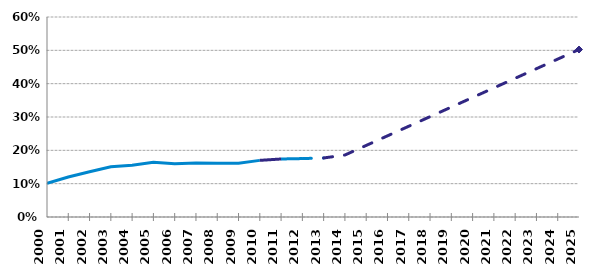
| Category | % EPCI  |
|---|---|
| 2000.0 | 0.101 |
| 2001.0 | 0.12 |
| 2002.0 | 0.136 |
| 2003.0 | 0.151 |
| 2004.0 | 0.155 |
| 2005.0 | 0.164 |
| 2006.0 | 0.16 |
| 2007.0 | 0.162 |
| 2008.0 | 0.161 |
| 2009.0 | 0.162 |
| 2010.0 | 0.17 |
| 2011.0 | 0.174 |
| 2012.0 | 0.175 |
| 2013.0 | 0.177 |
| 2014.0 | 0.186 |
| 2015.0 | 0.215 |
| 2016.0 | 0.243 |
| 2017.0 | 0.272 |
| 2018.0 | 0.301 |
| 2019.0 | 0.33 |
| 2020.0 | 0.359 |
| 2021.0 | 0.387 |
| 2022.0 | 0.416 |
| 2023.0 | 0.445 |
| 2024.0 | 0.474 |
| 2025.0 | 0.502 |